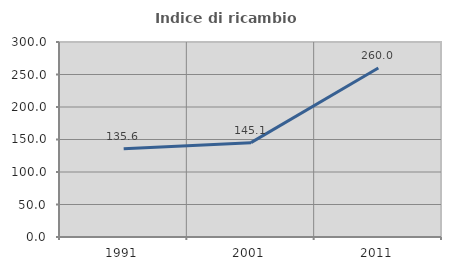
| Category | Indice di ricambio occupazionale  |
|---|---|
| 1991.0 | 135.616 |
| 2001.0 | 145.139 |
| 2011.0 | 260 |